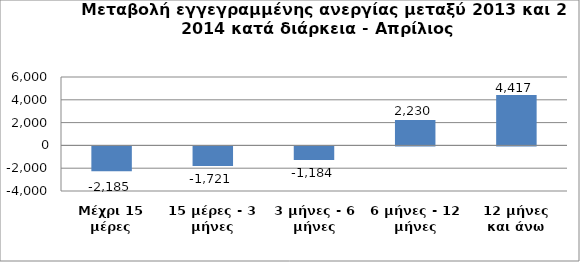
| Category | Series 0 |
|---|---|
| Μέχρι 15 μέρες | -2185 |
| 15 μέρες - 3 μήνες | -1721 |
| 3 μήνες - 6 μήνες | -1184 |
| 6 μήνες - 12 μήνες | 2230 |
| 12 μήνες και άνω | 4417 |